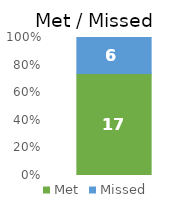
| Category | Met | Missed |
|---|---|---|
| Amount | 17 | 6 |